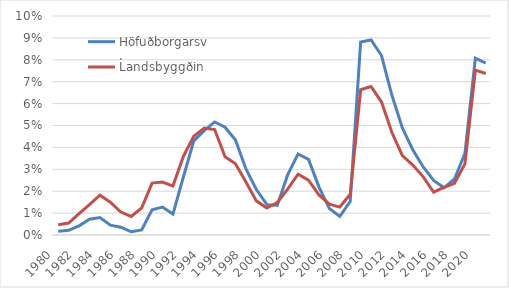
| Category | Höfuðborgarsv. | Landsbyggðin |
|---|---|---|
| 1980.0 | 0.177 | 0.473 |
| 1981.0 | 0.215 | 0.546 |
| 1982.0 | 0.419 | 0.976 |
| 1983.0 | 0.724 | 1.389 |
| 1984.0 | 0.797 | 1.818 |
| 1985.0 | 0.451 | 1.499 |
| 1986.0 | 0.356 | 1.048 |
| 1987.0 | 0.148 | 0.846 |
| 1988.0 | 0.231 | 1.231 |
| 1989.0 | 1.148 | 2.37 |
| 1990.0 | 1.274 | 2.418 |
| 1991.0 | 0.956 | 2.232 |
| 1992.0 | 2.649 | 3.587 |
| 1993.0 | 4.297 | 4.513 |
| 1994.0 | 4.769 | 4.887 |
| 1995.0 | 5.162 | 4.816 |
| 1996.0 | 4.92 | 3.575 |
| 1997.0 | 4.334 | 3.254 |
| 1998.0 | 3.014 | 2.416 |
| 1999.0 | 2.078 | 1.559 |
| 2000.0 | 1.397 | 1.229 |
| 2001.0 | 1.349 | 1.484 |
| 2002.0 | 2.742 | 2.093 |
| 2003.0 | 3.701 | 2.774 |
| 2004.0 | 3.451 | 2.501 |
| 2005.0 | 2.197 | 1.827 |
| 2006.0 | 1.209 | 1.411 |
| 2007.0 | 0.852 | 1.275 |
| 2008.0 | 1.525 | 1.857 |
| 2009.0 | 8.814 | 6.633 |
| 2010.0 | 8.903 | 6.782 |
| 2011.0 | 8.195 | 6.071 |
| 2012.0 | 6.379 | 4.678 |
| 2013.0 | 4.889 | 3.621 |
| 2014.0 | 3.893 | 3.192 |
| 2015.0 | 3.106 | 2.656 |
| 2016.0 | 2.49 | 1.96 |
| 2017.0 | 2.155 | 2.179 |
| 2018.0 | 2.558 | 2.357 |
| 2019.0 | 3.734 | 3.246 |
| 2020.0 | 8.071 | 7.527 |
| 2021.0 | 7.849 | 7.376 |